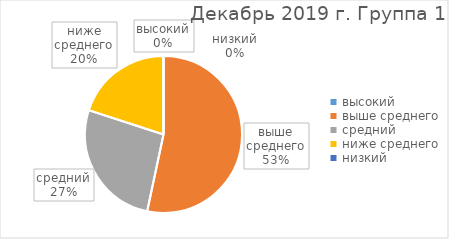
| Category | Series 0 |
|---|---|
| высокий | 0 |
| выше среднего | 8 |
| средний | 4 |
| ниже среднего | 3 |
| низкий | 0 |